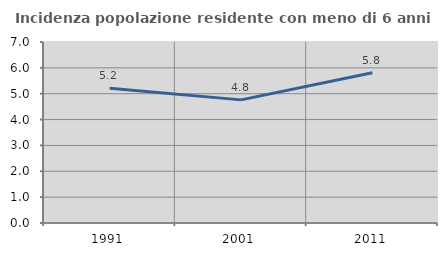
| Category | Incidenza popolazione residente con meno di 6 anni |
|---|---|
| 1991.0 | 5.213 |
| 2001.0 | 4.762 |
| 2011.0 | 5.814 |